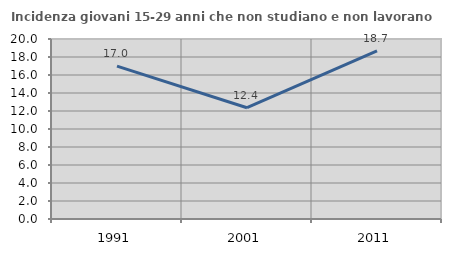
| Category | Incidenza giovani 15-29 anni che non studiano e non lavorano  |
|---|---|
| 1991.0 | 16.983 |
| 2001.0 | 12.365 |
| 2011.0 | 18.677 |